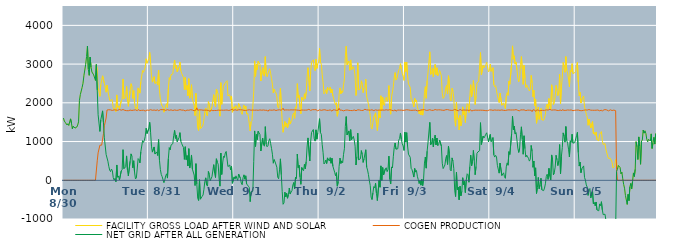
| Category | FACILITY GROSS LOAD AFTER WIND AND SOLAR | COGEN PRODUCTION | NET GRID AFTER ALL GENERATION |
|---|---|---|---|
|  Mon  8/30 | 1606 | 0 | 1606 |
|  Mon  8/30 | 1529 | 0 | 1529 |
|  Mon  8/30 | 1496 | 0 | 1496 |
|  Mon  8/30 | 1489 | 0 | 1489 |
|  Mon  8/30 | 1428 | 0 | 1428 |
|  Mon  8/30 | 1460 | 0 | 1460 |
|  Mon  8/30 | 1415 | 0 | 1415 |
|  Mon  8/30 | 1504 | 0 | 1504 |
|  Mon  8/30 | 1586 | 0 | 1586 |
|  Mon  8/30 | 1477 | 0 | 1477 |
|  Mon  8/30 | 1332 | 0 | 1332 |
|  Mon  8/30 | 1395 | 0 | 1395 |
|  Mon  8/30 | 1419 | 0 | 1419 |
|  Mon  8/30 | 1347 | 0 | 1347 |
|  Mon  8/30 | 1366 | 0 | 1366 |
|  Mon  8/30 | 1374 | 0 | 1374 |
|  Mon  8/30 | 1426 | 0 | 1426 |
|  Mon  8/30 | 1508 | 0 | 1508 |
|  Mon  8/30 | 2064 | 0 | 2064 |
|  Mon  8/30 | 2212 | 0 | 2212 |
|  Mon  8/30 | 2215 | 0 | 2215 |
|  Mon  8/30 | 2397 | 0 | 2397 |
|  Mon  8/30 | 2505 | 0 | 2505 |
|  Mon  8/30 | 2698 | 0 | 2698 |
|  Mon  8/30 | 2696 | 0 | 2696 |
|  Mon  8/30 | 2994 | 0 | 2994 |
|  Mon  8/30 | 3196 | 0 | 3196 |
|  Mon  8/30 | 3467 | 0 | 3467 |
|  Mon  8/30 | 2863 | 0 | 2863 |
|  Mon  8/30 | 2710 | 0 | 2710 |
|  Mon  8/30 | 3181 | 0 | 3181 |
|  Mon  8/30 | 2923 | 0 | 2923 |
|  Mon  8/30 | 2797 | 0 | 2797 |
|  Mon  8/30 | 2781 | 0 | 2781 |
|  Mon  8/30 | 2721 | 0 | 2721 |
|  Mon  8/30 | 2726 | 0 | 2726 |
|  Mon  8/30 | 2579 | 0 | 2579 |
|  Mon  8/30 | 2987 | 0 | 2987 |
|  Mon  8/30 | 2834 | 502 | 2332 |
|  Mon  8/30 | 2400 | 708 | 1692 |
|  Mon  8/30 | 2392 | 714 | 1678 |
|  Mon  8/30 | 2168 | 906 | 1262 |
|  Mon  8/30 | 2476 | 915 | 1561 |
|  Mon  8/30 | 2453 | 907 | 1546 |
|  Mon  8/30 | 2697 | 905 | 1792 |
|  Mon  8/30 | 2689 | 1201 | 1488 |
|  Mon  8/30 | 2502 | 1406 | 1096 |
|  Mon  8/30 | 2523 | 1409 | 1114 |
|  Mon  8/30 | 2274 | 1609 | 665 |
|  Mon  8/30 | 2458 | 1814 | 644 |
|  Mon  8/30 | 2309 | 1817 | 492 |
|  Mon  8/30 | 2182 | 1821 | 361 |
|  Mon  8/30 | 2069 | 1807 | 262 |
|  Mon  8/30 | 2041 | 1817 | 224 |
|  Mon  8/30 | 2091 | 1802 | 289 |
|  Mon  8/30 | 2051 | 1803 | 248 |
|  Mon  8/30 | 1878 | 1808 | 70 |
|  Mon  8/30 | 1826 | 1818 | 8 |
|  Mon  8/30 | 1856 | 1807 | 49 |
|  Mon  8/30 | 1775 | 1814 | -39 |
|  Mon  8/30 | 2204 | 1809 | 395 |
|  Mon  8/30 | 1884 | 1806 | 78 |
|  Mon  8/30 | 1917 | 1807 | 110 |
|  Mon  8/30 | 1835 | 1827 | 8 |
|  Mon  8/30 | 1840 | 1812 | 28 |
|  Mon  8/30 | 2051 | 1810 | 241 |
|  Mon  8/30 | 2090 | 1816 | 274 |
|  Mon  8/30 | 2616 | 1826 | 790 |
|  Mon  8/30 | 2102 | 1803 | 299 |
|  Mon  8/30 | 2108 | 1806 | 302 |
|  Mon  8/30 | 2161 | 1812 | 349 |
|  Mon  8/30 | 2427 | 1798 | 629 |
|  Mon  8/30 | 2080 | 1819 | 261 |
|  Mon  8/30 | 1909 | 1796 | 113 |
|  Mon  8/30 | 1905 | 1806 | 99 |
|  Mon  8/30 | 2303 | 1812 | 491 |
|  Mon  8/30 | 2494 | 1812 | 682 |
|  Mon  8/30 | 2420 | 1803 | 617 |
|  Mon  8/30 | 2114 | 1792 | 322 |
|  Mon  8/30 | 2315 | 1811 | 504 |
|  Mon  8/30 | 2003 | 1806 | 197 |
|  Mon  8/30 | 1853 | 1818 | 35 |
|  Mon  8/30 | 1882 | 1821 | 61 |
|  Mon  8/30 | 1833 | 1797 | 36 |
|  Mon  8/30 | 2384 | 1825 | 559 |
|  Mon  8/30 | 2334 | 1802 | 532 |
|  Mon  8/30 | 2250 | 1801 | 449 |
|  Mon  8/30 | 2544 | 1812 | 732 |
|  Mon  8/30 | 2548 | 1806 | 742 |
|  Mon  8/30 | 2835 | 1812 | 1023 |
|  Mon  8/30 | 2788 | 1809 | 979 |
|  Mon  8/30 | 2854 | 1821 | 1033 |
|  Mon  8/30 | 2923 | 1788 | 1135 |
|  Mon  8/30 | 3137 | 1794 | 1343 |
|  Mon  8/30 | 3021 | 1814 | 1207 |
|  Mon  8/30 | 3036 | 1812 | 1224 |
|  Tue  8/31 | 3146 | 1805 | 1341 |
|  Tue  8/31 | 3303 | 1807 | 1496 |
|  Tue  8/31 | 3059 | 1823 | 1236 |
|  Tue  8/31 | 2695 | 1815 | 880 |
|  Tue  8/31 | 2534 | 1807 | 727 |
|  Tue  8/31 | 2529 | 1787 | 742 |
|  Tue  8/31 | 2674 | 1814 | 860 |
|  Tue  8/31 | 2500 | 1823 | 677 |
|  Tue  8/31 | 2507 | 1804 | 703 |
|  Tue  8/31 | 2540 | 1808 | 732 |
|  Tue  8/31 | 2459 | 1820 | 639 |
|  Tue  8/31 | 2844 | 1793 | 1051 |
|  Tue  8/31 | 2318 | 1802 | 516 |
|  Tue  8/31 | 2100 | 1823 | 277 |
|  Tue  8/31 | 1971 | 1820 | 151 |
|  Tue  8/31 | 1917 | 1823 | 94 |
|  Tue  8/31 | 1890 | 1809 | 81 |
|  Tue  8/31 | 1758 | 1821 | -63 |
|  Tue  8/31 | 1824 | 1810 | 14 |
|  Tue  8/31 | 1921 | 1805 | 116 |
|  Tue  8/31 | 1979 | 1812 | 167 |
|  Tue  8/31 | 1879 | 1823 | 56 |
|  Tue  8/31 | 2377 | 1815 | 562 |
|  Tue  8/31 | 2649 | 1807 | 842 |
|  Tue  8/31 | 2593 | 1807 | 786 |
|  Tue  8/31 | 2725 | 1818 | 907 |
|  Tue  8/31 | 2716 | 1828 | 888 |
|  Tue  8/31 | 2748 | 1802 | 946 |
|  Tue  8/31 | 2969 | 1810 | 1159 |
|  Tue  8/31 | 3103 | 1816 | 1287 |
|  Tue  8/31 | 2889 | 1807 | 1082 |
|  Tue  8/31 | 2968 | 1806 | 1162 |
|  Tue  8/31 | 2800 | 1805 | 995 |
|  Tue  8/31 | 2799 | 1809 | 990 |
|  Tue  8/31 | 2922 | 1818 | 1104 |
|  Tue  8/31 | 3054 | 1824 | 1230 |
|  Tue  8/31 | 2830 | 1822 | 1008 |
|  Tue  8/31 | 2757 | 1811 | 946 |
|  Tue  8/31 | 2763 | 1805 | 958 |
|  Tue  8/31 | 2655 | 1811 | 844 |
|  Tue  8/31 | 2343 | 1803 | 540 |
|  Tue  8/31 | 2657 | 1791 | 866 |
|  Tue  8/31 | 2342 | 1809 | 533 |
|  Tue  8/31 | 2450 | 1812 | 638 |
|  Tue  8/31 | 2184 | 1815 | 369 |
|  Tue  8/31 | 2624 | 1808 | 816 |
|  Tue  8/31 | 2121 | 1805 | 316 |
|  Tue  8/31 | 2281 | 1821 | 460 |
|  Tue  8/31 | 2468 | 1815 | 653 |
|  Tue  8/31 | 2102 | 1814 | 288 |
|  Tue  8/31 | 2079 | 1790 | 289 |
|  Tue  8/31 | 1930 | 1795 | 135 |
|  Tue  8/31 | 1670 | 1805 | -135 |
|  Tue  8/31 | 2244 | 1815 | 429 |
|  Tue  8/31 | 1769 | 1871 | -102 |
|  Tue  8/31 | 1350 | 1809 | -459 |
|  Tue  8/31 | 1285 | 1807 | -522 |
|  Tue  8/31 | 1832 | 1817 | 15 |
|  Tue  8/31 | 1329 | 1818 | -489 |
|  Tue  8/31 | 1334 | 1817 | -483 |
|  Tue  8/31 | 1383 | 1798 | -415 |
|  Tue  8/31 | 1429 | 1809 | -380 |
|  Tue  8/31 | 1574 | 1806 | -232 |
|  Tue  8/31 | 1784 | 1810 | -26 |
|  Tue  8/31 | 1863 | 1800 | 63 |
|  Tue  8/31 | 1691 | 1810 | -119 |
|  Tue  8/31 | 1661 | 1812 | -151 |
|  Tue  8/31 | 2031 | 1804 | 227 |
|  Tue  8/31 | 1959 | 1812 | 147 |
|  Tue  8/31 | 1768 | 1781 | -13 |
|  Tue  8/31 | 1781 | 1816 | -35 |
|  Tue  8/31 | 1896 | 1805 | 91 |
|  Tue  8/31 | 1875 | 1797 | 78 |
|  Tue  8/31 | 2211 | 1808 | 403 |
|  Tue  8/31 | 1988 | 1803 | 185 |
|  Tue  8/31 | 1892 | 1821 | 71 |
|  Tue  8/31 | 2357 | 1802 | 555 |
|  Tue  8/31 | 2284 | 1817 | 467 |
|  Tue  8/31 | 2228 | 1812 | 416 |
|  Tue  8/31 | 1868 | 1812 | 56 |
|  Tue  8/31 | 1655 | 1807 | -152 |
|  Tue  8/31 | 2520 | 1818 | 702 |
|  Tue  8/31 | 1961 | 1811 | 150 |
|  Tue  8/31 | 2254 | 1816 | 438 |
|  Tue  8/31 | 2427 | 1808 | 619 |
|  Tue  8/31 | 2404 | 1814 | 590 |
|  Tue  8/31 | 2516 | 1812 | 704 |
|  Tue  8/31 | 2545 | 1801 | 744 |
|  Tue  8/31 | 2571 | 1814 | 757 |
|  Tue  8/31 | 2179 | 1825 | 354 |
|  Tue  8/31 | 2175 | 1802 | 373 |
|  Tue  8/31 | 2209 | 1815 | 394 |
|  Tue  8/31 | 2083 | 1816 | 267 |
|  Tue  8/31 | 2172 | 1810 | 362 |
|  Tue  8/31 | 1757 | 1836 | -79 |
|  Tue  8/31 | 1742 | 1805 | -63 |
|  Wed  9/1 | 1897 | 1810 | 87 |
|  Wed  9/1 | 1848 | 1820 | 28 |
|  Wed  9/1 | 1928 | 1814 | 114 |
|  Wed  9/1 | 1851 | 1807 | 44 |
|  Wed  9/1 | 1807 | 1810 | -3 |
|  Wed  9/1 | 1981 | 1820 | 161 |
|  Wed  9/1 | 1956 | 1812 | 144 |
|  Wed  9/1 | 1868 | 1821 | 47 |
|  Wed  9/1 | 1748 | 1819 | -71 |
|  Wed  9/1 | 1702 | 1817 | -115 |
|  Wed  9/1 | 1875 | 1810 | 65 |
|  Wed  9/1 | 1945 | 1805 | 140 |
|  Wed  9/1 | 1836 | 1807 | 29 |
|  Wed  9/1 | 1917 | 1802 | 115 |
|  Wed  9/1 | 1709 | 1803 | -94 |
|  Wed  9/1 | 1736 | 1812 | -76 |
|  Wed  9/1 | 1648 | 1802 | -154 |
|  Wed  9/1 | 1635 | 1821 | -186 |
|  Wed  9/1 | 1273 | 1824 | -551 |
|  Wed  9/1 | 1512 | 1809 | -297 |
|  Wed  9/1 | 1538 | 1821 | -283 |
|  Wed  9/1 | 1532 | 1814 | -282 |
|  Wed  9/1 | 2284 | 1794 | 490 |
|  Wed  9/1 | 3083 | 1809 | 1274 |
|  Wed  9/1 | 2682 | 1809 | 873 |
|  Wed  9/1 | 2995 | 1812 | 1183 |
|  Wed  9/1 | 2857 | 1806 | 1051 |
|  Wed  9/1 | 3075 | 1807 | 1268 |
|  Wed  9/1 | 3038 | 1815 | 1223 |
|  Wed  9/1 | 2996 | 1816 | 1180 |
|  Wed  9/1 | 2563 | 1807 | 756 |
|  Wed  9/1 | 2555 | 1809 | 746 |
|  Wed  9/1 | 2911 | 1820 | 1091 |
|  Wed  9/1 | 2736 | 1815 | 921 |
|  Wed  9/1 | 2689 | 1809 | 880 |
|  Wed  9/1 | 3192 | 1807 | 1385 |
|  Wed  9/1 | 2746 | 1814 | 932 |
|  Wed  9/1 | 2673 | 1808 | 865 |
|  Wed  9/1 | 2673 | 1781 | 892 |
|  Wed  9/1 | 2832 | 1815 | 1017 |
|  Wed  9/1 | 2880 | 1807 | 1073 |
|  Wed  9/1 | 2758 | 1811 | 947 |
|  Wed  9/1 | 2627 | 1803 | 824 |
|  Wed  9/1 | 2481 | 1809 | 672 |
|  Wed  9/1 | 2253 | 1812 | 441 |
|  Wed  9/1 | 2353 | 1819 | 534 |
|  Wed  9/1 | 2287 | 1810 | 477 |
|  Wed  9/1 | 2256 | 1801 | 455 |
|  Wed  9/1 | 2153 | 1816 | 337 |
|  Wed  9/1 | 1894 | 1814 | 80 |
|  Wed  9/1 | 1859 | 1820 | 39 |
|  Wed  9/1 | 2088 | 1820 | 268 |
|  Wed  9/1 | 2373 | 1820 | 553 |
|  Wed  9/1 | 1948 | 1806 | 142 |
|  Wed  9/1 | 1518 | 1807 | -289 |
|  Wed  9/1 | 1240 | 1860 | -620 |
|  Wed  9/1 | 1228 | 1811 | -583 |
|  Wed  9/1 | 1514 | 1821 | -307 |
|  Wed  9/1 | 1389 | 1816 | -427 |
|  Wed  9/1 | 1473 | 1810 | -337 |
|  Wed  9/1 | 1352 | 1816 | -464 |
|  Wed  9/1 | 1443 | 1811 | -368 |
|  Wed  9/1 | 1613 | 1813 | -200 |
|  Wed  9/1 | 1452 | 1808 | -356 |
|  Wed  9/1 | 1515 | 1818 | -303 |
|  Wed  9/1 | 1551 | 1817 | -266 |
|  Wed  9/1 | 1695 | 1816 | -121 |
|  Wed  9/1 | 1740 | 1799 | -59 |
|  Wed  9/1 | 1599 | 1818 | -219 |
|  Wed  9/1 | 1896 | 1820 | 76 |
|  Wed  9/1 | 1857 | 1814 | 43 |
|  Wed  9/1 | 2495 | 1818 | 677 |
|  Wed  9/1 | 2136 | 1809 | 327 |
|  Wed  9/1 | 2197 | 1811 | 386 |
|  Wed  9/1 | 1888 | 1802 | 86 |
|  Wed  9/1 | 1718 | 1822 | -104 |
|  Wed  9/1 | 2143 | 1814 | 329 |
|  Wed  9/1 | 2089 | 1816 | 273 |
|  Wed  9/1 | 2058 | 1812 | 246 |
|  Wed  9/1 | 2233 | 1821 | 412 |
|  Wed  9/1 | 2106 | 1811 | 295 |
|  Wed  9/1 | 2282 | 1799 | 483 |
|  Wed  9/1 | 2672 | 1813 | 859 |
|  Wed  9/1 | 2907 | 1813 | 1094 |
|  Wed  9/1 | 2903 | 1833 | 1070 |
|  Wed  9/1 | 2306 | 1808 | 498 |
|  Wed  9/1 | 2796 | 1804 | 992 |
|  Wed  9/1 | 3047 | 1812 | 1235 |
|  Wed  9/1 | 3034 | 1822 | 1212 |
|  Wed  9/1 | 3112 | 1802 | 1310 |
|  Wed  9/1 | 2899 | 1822 | 1077 |
|  Wed  9/1 | 2831 | 1820 | 1011 |
|  Wed  9/1 | 3125 | 1823 | 1302 |
|  Wed  9/1 | 2889 | 1828 | 1061 |
|  Wed  9/1 | 3011 | 1793 | 1218 |
|  Wed  9/1 | 3054 | 1817 | 1237 |
|  Thu  9/2 | 3410 | 1820 | 1590 |
|  Thu  9/2 | 3056 | 1826 | 1230 |
|  Thu  9/2 | 2994 | 1806 | 1188 |
|  Thu  9/2 | 2731 | 1811 | 920 |
|  Thu  9/2 | 2528 | 1817 | 711 |
|  Thu  9/2 | 2234 | 1813 | 421 |
|  Thu  9/2 | 2270 | 1821 | 449 |
|  Thu  9/2 | 2341 | 1818 | 523 |
|  Thu  9/2 | 2237 | 1806 | 431 |
|  Thu  9/2 | 2402 | 1823 | 579 |
|  Thu  9/2 | 2364 | 1805 | 559 |
|  Thu  9/2 | 2321 | 1824 | 497 |
|  Thu  9/2 | 2401 | 1817 | 584 |
|  Thu  9/2 | 2254 | 1815 | 439 |
|  Thu  9/2 | 2354 | 1785 | 569 |
|  Thu  9/2 | 2180 | 1817 | 363 |
|  Thu  9/2 | 2183 | 1813 | 370 |
|  Thu  9/2 | 2022 | 1817 | 205 |
|  Thu  9/2 | 1945 | 1828 | 117 |
|  Thu  9/2 | 2001 | 1804 | 197 |
|  Thu  9/2 | 1654 | 1807 | -153 |
|  Thu  9/2 | 1768 | 1811 | -43 |
|  Thu  9/2 | 2216 | 1859 | 357 |
|  Thu  9/2 | 2385 | 1812 | 573 |
|  Thu  9/2 | 2235 | 1800 | 435 |
|  Thu  9/2 | 2311 | 1810 | 501 |
|  Thu  9/2 | 2265 | 1813 | 452 |
|  Thu  9/2 | 2463 | 1792 | 671 |
|  Thu  9/2 | 2626 | 1801 | 825 |
|  Thu  9/2 | 3200 | 1809 | 1391 |
|  Thu  9/2 | 3461 | 1816 | 1645 |
|  Thu  9/2 | 2984 | 1815 | 1169 |
|  Thu  9/2 | 2983 | 1819 | 1164 |
|  Thu  9/2 | 3080 | 1806 | 1274 |
|  Thu  9/2 | 2840 | 1817 | 1023 |
|  Thu  9/2 | 3108 | 1801 | 1307 |
|  Thu  9/2 | 2856 | 1809 | 1047 |
|  Thu  9/2 | 2857 | 1799 | 1058 |
|  Thu  9/2 | 2936 | 1802 | 1134 |
|  Thu  9/2 | 2855 | 1815 | 1040 |
|  Thu  9/2 | 2690 | 1811 | 879 |
|  Thu  9/2 | 2190 | 1796 | 394 |
|  Thu  9/2 | 2400 | 1788 | 612 |
|  Thu  9/2 | 3035 | 1819 | 1216 |
|  Thu  9/2 | 2335 | 1806 | 529 |
|  Thu  9/2 | 2354 | 1815 | 539 |
|  Thu  9/2 | 2364 | 1808 | 556 |
|  Thu  9/2 | 2569 | 1803 | 766 |
|  Thu  9/2 | 2482 | 1816 | 666 |
|  Thu  9/2 | 2265 | 1804 | 461 |
|  Thu  9/2 | 2369 | 1816 | 553 |
|  Thu  9/2 | 2398 | 1834 | 564 |
|  Thu  9/2 | 2609 | 1821 | 788 |
|  Thu  9/2 | 2159 | 1817 | 342 |
|  Thu  9/2 | 2069 | 1806 | 263 |
|  Thu  9/2 | 1961 | 1814 | 147 |
|  Thu  9/2 | 1807 | 1818 | -11 |
|  Thu  9/2 | 1677 | 1809 | -132 |
|  Thu  9/2 | 1360 | 1796 | -436 |
|  Thu  9/2 | 1323 | 1820 | -497 |
|  Thu  9/2 | 1482 | 1811 | -329 |
|  Thu  9/2 | 1635 | 1799 | -164 |
|  Thu  9/2 | 1616 | 1810 | -194 |
|  Thu  9/2 | 1742 | 1818 | -76 |
|  Thu  9/2 | 1487 | 1827 | -340 |
|  Thu  9/2 | 1284 | 1808 | -524 |
|  Thu  9/2 | 1280 | 1821 | -541 |
|  Thu  9/2 | 1811 | 1813 | -2 |
|  Thu  9/2 | 1609 | 1789 | -180 |
|  Thu  9/2 | 2182 | 1810 | 372 |
|  Thu  9/2 | 1797 | 1799 | -2 |
|  Thu  9/2 | 2143 | 1814 | 329 |
|  Thu  9/2 | 1959 | 1823 | 136 |
|  Thu  9/2 | 1931 | 1810 | 121 |
|  Thu  9/2 | 2110 | 1814 | 296 |
|  Thu  9/2 | 2144 | 1821 | 323 |
|  Thu  9/2 | 2035 | 1813 | 222 |
|  Thu  9/2 | 2093 | 1810 | 283 |
|  Thu  9/2 | 2444 | 1821 | 623 |
|  Thu  9/2 | 1847 | 1823 | 24 |
|  Thu  9/2 | 1706 | 1803 | -97 |
|  Thu  9/2 | 2154 | 1809 | 345 |
|  Thu  9/2 | 2132 | 1815 | 317 |
|  Thu  9/2 | 2415 | 1795 | 620 |
|  Thu  9/2 | 2667 | 1813 | 854 |
|  Thu  9/2 | 2780 | 1817 | 963 |
|  Thu  9/2 | 2587 | 1784 | 803 |
|  Thu  9/2 | 2624 | 1802 | 822 |
|  Thu  9/2 | 2628 | 1814 | 814 |
|  Thu  9/2 | 2840 | 1807 | 1033 |
|  Thu  9/2 | 2887 | 1811 | 1076 |
|  Thu  9/2 | 3009 | 1788 | 1221 |
|  Thu  9/2 | 2866 | 1811 | 1055 |
|  Thu  9/2 | 2751 | 1808 | 943 |
|  Thu  9/2 | 2690 | 1804 | 886 |
|  Thu  9/2 | 2579 | 1809 | 770 |
|  Fri  9/3 | 3053 | 1811 | 1242 |
|  Fri  9/3 | 2806 | 1819 | 987 |
|  Fri  9/3 | 3050 | 1821 | 1229 |
|  Fri  9/3 | 2697 | 1812 | 885 |
|  Fri  9/3 | 2489 | 1815 | 674 |
|  Fri  9/3 | 2506 | 1816 | 690 |
|  Fri  9/3 | 2400 | 1807 | 593 |
|  Fri  9/3 | 2106 | 1797 | 309 |
|  Fri  9/3 | 2079 | 1806 | 273 |
|  Fri  9/3 | 1990 | 1805 | 185 |
|  Fri  9/3 | 1892 | 1809 | 83 |
|  Fri  9/3 | 2112 | 1807 | 305 |
|  Fri  9/3 | 2023 | 1812 | 211 |
|  Fri  9/3 | 2070 | 1817 | 253 |
|  Fri  9/3 | 1897 | 1793 | 104 |
|  Fri  9/3 | 1821 | 1804 | 17 |
|  Fri  9/3 | 1716 | 1799 | -83 |
|  Fri  9/3 | 1792 | 1799 | -7 |
|  Fri  9/3 | 1688 | 1814 | -126 |
|  Fri  9/3 | 1836 | 1809 | 27 |
|  Fri  9/3 | 1682 | 1819 | -137 |
|  Fri  9/3 | 1857 | 1820 | 37 |
|  Fri  9/3 | 2268 | 1824 | 444 |
|  Fri  9/3 | 2418 | 1817 | 601 |
|  Fri  9/3 | 2118 | 1805 | 313 |
|  Fri  9/3 | 2570 | 1818 | 752 |
|  Fri  9/3 | 2788 | 1809 | 979 |
|  Fri  9/3 | 2807 | 1805 | 1002 |
|  Fri  9/3 | 3317 | 1822 | 1495 |
|  Fri  9/3 | 2732 | 1814 | 918 |
|  Fri  9/3 | 2768 | 1806 | 962 |
|  Fri  9/3 | 2903 | 1812 | 1091 |
|  Fri  9/3 | 2666 | 1806 | 860 |
|  Fri  9/3 | 2883 | 1809 | 1074 |
|  Fri  9/3 | 2994 | 1827 | 1167 |
|  Fri  9/3 | 2727 | 1813 | 914 |
|  Fri  9/3 | 2905 | 1814 | 1091 |
|  Fri  9/3 | 2698 | 1803 | 895 |
|  Fri  9/3 | 2741 | 1819 | 922 |
|  Fri  9/3 | 2841 | 1804 | 1037 |
|  Fri  9/3 | 2864 | 1817 | 1047 |
|  Fri  9/3 | 2695 | 1812 | 883 |
|  Fri  9/3 | 2249 | 1809 | 440 |
|  Fri  9/3 | 2114 | 1812 | 302 |
|  Fri  9/3 | 2152 | 1806 | 346 |
|  Fri  9/3 | 2209 | 1813 | 396 |
|  Fri  9/3 | 2392 | 1822 | 570 |
|  Fri  9/3 | 2448 | 1808 | 640 |
|  Fri  9/3 | 2235 | 1825 | 410 |
|  Fri  9/3 | 2699 | 1821 | 878 |
|  Fri  9/3 | 2497 | 1812 | 685 |
|  Fri  9/3 | 2079 | 1811 | 268 |
|  Fri  9/3 | 2048 | 1806 | 242 |
|  Fri  9/3 | 2377 | 1799 | 578 |
|  Fri  9/3 | 2301 | 1806 | 495 |
|  Fri  9/3 | 2120 | 1823 | 297 |
|  Fri  9/3 | 1573 | 1829 | -256 |
|  Fri  9/3 | 1395 | 1816 | -421 |
|  Fri  9/3 | 2018 | 1812 | 206 |
|  Fri  9/3 | 1576 | 1818 | -242 |
|  Fri  9/3 | 1612 | 1793 | -181 |
|  Fri  9/3 | 1299 | 1803 | -504 |
|  Fri  9/3 | 1674 | 1828 | -154 |
|  Fri  9/3 | 1407 | 1808 | -401 |
|  Fri  9/3 | 1519 | 1805 | -286 |
|  Fri  9/3 | 1896 | 1830 | 66 |
|  Fri  9/3 | 1692 | 1814 | -122 |
|  Fri  9/3 | 1789 | 1818 | -29 |
|  Fri  9/3 | 1493 | 1811 | -318 |
|  Fri  9/3 | 1820 | 1814 | 6 |
|  Fri  9/3 | 1979 | 1811 | 168 |
|  Fri  9/3 | 1953 | 1811 | 142 |
|  Fri  9/3 | 1753 | 1804 | -51 |
|  Fri  9/3 | 2155 | 1802 | 353 |
|  Fri  9/3 | 2467 | 1820 | 647 |
|  Fri  9/3 | 2160 | 1788 | 372 |
|  Fri  9/3 | 2297 | 1807 | 490 |
|  Fri  9/3 | 2575 | 1804 | 771 |
|  Fri  9/3 | 2316 | 1811 | 505 |
|  Fri  9/3 | 1955 | 1811 | 144 |
|  Fri  9/3 | 2171 | 1814 | 357 |
|  Fri  9/3 | 2504 | 1809 | 695 |
|  Fri  9/3 | 2527 | 1798 | 729 |
|  Fri  9/3 | 2562 | 1809 | 753 |
|  Fri  9/3 | 2574 | 1809 | 765 |
|  Fri  9/3 | 3297 | 1810 | 1487 |
|  Fri  9/3 | 2727 | 1803 | 924 |
|  Fri  9/3 | 2730 | 1808 | 922 |
|  Fri  9/3 | 2965 | 1822 | 1143 |
|  Fri  9/3 | 2899 | 1805 | 1094 |
|  Fri  9/3 | 2949 | 1811 | 1138 |
|  Fri  9/3 | 2987 | 1798 | 1189 |
|  Fri  9/3 | 3047 | 1821 | 1226 |
|  Fri  9/3 | 3048 | 1797 | 1251 |
|  Fri  9/3 | 2799 | 1806 | 993 |
|  Fri  9/3 | 2828 | 1816 | 1012 |
|  Sat  9/4 | 3001 | 1819 | 1182 |
|  Sat  9/4 | 2812 | 1816 | 996 |
|  Sat  9/4 | 2854 | 1812 | 1042 |
|  Sat  9/4 | 2908 | 1805 | 1103 |
|  Sat  9/4 | 2467 | 1810 | 657 |
|  Sat  9/4 | 2415 | 1816 | 599 |
|  Sat  9/4 | 2442 | 1799 | 643 |
|  Sat  9/4 | 2419 | 1809 | 610 |
|  Sat  9/4 | 2190 | 1804 | 386 |
|  Sat  9/4 | 2212 | 1812 | 400 |
|  Sat  9/4 | 2007 | 1823 | 184 |
|  Sat  9/4 | 2251 | 1807 | 444 |
|  Sat  9/4 | 2271 | 1817 | 454 |
|  Sat  9/4 | 1938 | 1816 | 122 |
|  Sat  9/4 | 1957 | 1812 | 145 |
|  Sat  9/4 | 1999 | 1806 | 193 |
|  Sat  9/4 | 1908 | 1817 | 91 |
|  Sat  9/4 | 1852 | 1802 | 50 |
|  Sat  9/4 | 2158 | 1811 | 347 |
|  Sat  9/4 | 2262 | 1813 | 449 |
|  Sat  9/4 | 2192 | 1804 | 388 |
|  Sat  9/4 | 2557 | 1818 | 739 |
|  Sat  9/4 | 2481 | 1813 | 668 |
|  Sat  9/4 | 2497 | 1814 | 683 |
|  Sat  9/4 | 3012 | 1816 | 1196 |
|  Sat  9/4 | 3470 | 1815 | 1655 |
|  Sat  9/4 | 3125 | 1821 | 1304 |
|  Sat  9/4 | 3214 | 1815 | 1399 |
|  Sat  9/4 | 3001 | 1807 | 1194 |
|  Sat  9/4 | 3054 | 1824 | 1230 |
|  Sat  9/4 | 2854 | 1812 | 1042 |
|  Sat  9/4 | 2637 | 1806 | 831 |
|  Sat  9/4 | 2542 | 1823 | 719 |
|  Sat  9/4 | 2619 | 1790 | 829 |
|  Sat  9/4 | 2993 | 1818 | 1175 |
|  Sat  9/4 | 3194 | 1814 | 1380 |
|  Sat  9/4 | 2869 | 1816 | 1053 |
|  Sat  9/4 | 2477 | 1805 | 672 |
|  Sat  9/4 | 2967 | 1818 | 1149 |
|  Sat  9/4 | 2630 | 1815 | 815 |
|  Sat  9/4 | 2399 | 1799 | 600 |
|  Sat  9/4 | 2462 | 1815 | 647 |
|  Sat  9/4 | 2417 | 1811 | 606 |
|  Sat  9/4 | 2358 | 1792 | 566 |
|  Sat  9/4 | 2305 | 1810 | 495 |
|  Sat  9/4 | 2356 | 1814 | 542 |
|  Sat  9/4 | 2707 | 1808 | 899 |
|  Sat  9/4 | 2519 | 1772 | 747 |
|  Sat  9/4 | 2156 | 1821 | 335 |
|  Sat  9/4 | 2322 | 1824 | 498 |
|  Sat  9/4 | 1926 | 1811 | 115 |
|  Sat  9/4 | 2099 | 1778 | 321 |
|  Sat  9/4 | 1472 | 1812 | -340 |
|  Sat  9/4 | 1625 | 1813 | -188 |
|  Sat  9/4 | 1890 | 1817 | 73 |
|  Sat  9/4 | 1573 | 1791 | -218 |
|  Sat  9/4 | 1672 | 1795 | -123 |
|  Sat  9/4 | 1855 | 1802 | 53 |
|  Sat  9/4 | 1560 | 1807 | -247 |
|  Sat  9/4 | 1538 | 1806 | -268 |
|  Sat  9/4 | 1550 | 1818 | -268 |
|  Sat  9/4 | 1604 | 1805 | -201 |
|  Sat  9/4 | 1702 | 1794 | -92 |
|  Sat  9/4 | 1915 | 1817 | 98 |
|  Sat  9/4 | 1968 | 1812 | 156 |
|  Sat  9/4 | 1835 | 1812 | 23 |
|  Sat  9/4 | 2111 | 1804 | 307 |
|  Sat  9/4 | 1929 | 1831 | 98 |
|  Sat  9/4 | 1822 | 1812 | 10 |
|  Sat  9/4 | 2465 | 1811 | 654 |
|  Sat  9/4 | 2335 | 1805 | 530 |
|  Sat  9/4 | 1956 | 1816 | 140 |
|  Sat  9/4 | 2011 | 1813 | 198 |
|  Sat  9/4 | 2157 | 1817 | 340 |
|  Sat  9/4 | 2449 | 1804 | 645 |
|  Sat  9/4 | 2334 | 1805 | 529 |
|  Sat  9/4 | 2186 | 1807 | 379 |
|  Sat  9/4 | 2297 | 1801 | 496 |
|  Sat  9/4 | 2735 | 1813 | 922 |
|  Sat  9/4 | 1981 | 1817 | 164 |
|  Sat  9/4 | 2409 | 1789 | 620 |
|  Sat  9/4 | 2665 | 1822 | 843 |
|  Sat  9/4 | 3040 | 1816 | 1224 |
|  Sat  9/4 | 2940 | 1805 | 1135 |
|  Sat  9/4 | 2787 | 1803 | 984 |
|  Sat  9/4 | 3193 | 1806 | 1387 |
|  Sat  9/4 | 2839 | 1814 | 1025 |
|  Sat  9/4 | 2772 | 1815 | 957 |
|  Sat  9/4 | 2613 | 1810 | 803 |
|  Sat  9/4 | 2412 | 1811 | 601 |
|  Sat  9/4 | 2837 | 1817 | 1020 |
|  Sat  9/4 | 2796 | 1815 | 981 |
|  Sat  9/4 | 3012 | 1823 | 1189 |
|  Sat  9/4 | 2756 | 1796 | 960 |
|  Sat  9/4 | 2754 | 1799 | 955 |
|  Sat  9/4 | 2778 | 1807 | 971 |
|  Sun  9/5 | 2808 | 1816 | 992 |
|  Sun  9/5 | 2963 | 1812 | 1151 |
|  Sun  9/5 | 3043 | 1805 | 1238 |
|  Sun  9/5 | 2526 | 1813 | 713 |
|  Sun  9/5 | 2179 | 1812 | 367 |
|  Sun  9/5 | 2268 | 1800 | 468 |
|  Sun  9/5 | 1994 | 1798 | 196 |
|  Sun  9/5 | 2094 | 1796 | 298 |
|  Sun  9/5 | 2092 | 1802 | 290 |
|  Sun  9/5 | 2178 | 1807 | 371 |
|  Sun  9/5 | 1886 | 1811 | 75 |
|  Sun  9/5 | 1818 | 1816 | 2 |
|  Sun  9/5 | 1700 | 1820 | -120 |
|  Sun  9/5 | 1636 | 1812 | -176 |
|  Sun  9/5 | 1420 | 1810 | -390 |
|  Sun  9/5 | 1582 | 1826 | -244 |
|  Sun  9/5 | 1599 | 1813 | -214 |
|  Sun  9/5 | 1354 | 1810 | -456 |
|  Sun  9/5 | 1346 | 1795 | -449 |
|  Sun  9/5 | 1515 | 1808 | -293 |
|  Sun  9/5 | 1200 | 1811 | -611 |
|  Sun  9/5 | 1235 | 1807 | -572 |
|  Sun  9/5 | 1157 | 1816 | -659 |
|  Sun  9/5 | 1248 | 1809 | -561 |
|  Sun  9/5 | 1051 | 1816 | -765 |
|  Sun  9/5 | 1045 | 1814 | -769 |
|  Sun  9/5 | 1019 | 1807 | -788 |
|  Sun  9/5 | 1184 | 1794 | -610 |
|  Sun  9/5 | 1160 | 1816 | -656 |
|  Sun  9/5 | 1258 | 1811 | -553 |
|  Sun  9/5 | 1018 | 1783 | -765 |
|  Sun  9/5 | 922 | 1810 | -888 |
|  Sun  9/5 | 936 | 1799 | -863 |
|  Sun  9/5 | 949 | 1825 | -876 |
|  Sun  9/5 | 801 | 1820 | -1019 |
|  Sun  9/5 | 784 | 1816 | -1032 |
|  Sun  9/5 | 625 | 1816 | -1191 |
|  Sun  9/5 | 564 | 1792 | -1228 |
|  Sun  9/5 | 586 | 1811 | -1225 |
|  Sun  9/5 | 568 | 1819 | -1251 |
|  Sun  9/5 | 573 | 1820 | -1247 |
|  Sun  9/5 | 465 | 1801 | -1336 |
|  Sun  9/5 | 316 | 1814 | -1498 |
|  Sun  9/5 | 335 | 1812 | -1477 |
|  Sun  9/5 | 374 | 1820 | -1446 |
|  Sun  9/5 | 536 | 1797 | -1261 |
|  Sun  9/5 | 502 | 272 | 230 |
|  Sun  9/5 | 281 | 0 | 281 |
|  Sun  9/5 | 382 | 0 | 382 |
|  Sun  9/5 | 375 | 0 | 375 |
|  Sun  9/5 | 329 | 0 | 329 |
|  Sun  9/5 | 162 | 0 | 162 |
|  Sun  9/5 | 212 | 0 | 212 |
|  Sun  9/5 | 37 | 0 | 37 |
|  Sun  9/5 | -106 | 0 | -106 |
|  Sun  9/5 | -204 | 0 | -204 |
|  Sun  9/5 | -391 | 0 | -391 |
|  Sun  9/5 | -415 | 0 | -415 |
|  Sun  9/5 | -622 | 0 | -622 |
|  Sun  9/5 | -364 | 0 | -364 |
|  Sun  9/5 | -525 | 0 | -525 |
|  Sun  9/5 | -171 | 0 | -171 |
|  Sun  9/5 | -82 | 0 | -82 |
|  Sun  9/5 | -221 | 0 | -221 |
|  Sun  9/5 | -34 | 0 | -34 |
|  Sun  9/5 | 190 | 0 | 190 |
|  Sun  9/5 | 97 | 0 | 97 |
|  Sun  9/5 | 284 | 0 | 284 |
|  Sun  9/5 | 995 | 0 | 995 |
|  Sun  9/5 | 865 | 0 | 865 |
|  Sun  9/5 | 536 | 0 | 536 |
|  Sun  9/5 | 1119 | 0 | 1119 |
|  Sun  9/5 | 877 | 0 | 877 |
|  Sun  9/5 | 413 | 0 | 413 |
|  Sun  9/5 | 1012 | 0 | 1012 |
|  Sun  9/5 | 1038 | 0 | 1038 |
|  Sun  9/5 | 1296 | 0 | 1296 |
|  Sun  9/5 | 1217 | 0 | 1217 |
|  Sun  9/5 | 1278 | 0 | 1278 |
|  Sun  9/5 | 1208 | 0 | 1208 |
|  Sun  9/5 | 1060 | 0 | 1060 |
|  Sun  9/5 | 995 | 0 | 995 |
|  Sun  9/5 | 1060 | 0 | 1060 |
|  Sun  9/5 | 1062 | 0 | 1062 |
|  Sun  9/5 | 1014 | 0 | 1014 |
|  Sun  9/5 | 1198 | 0 | 1198 |
|  Sun  9/5 | 822 | 0 | 822 |
|  Sun  9/5 | 966 | 0 | 966 |
|  Sun  9/5 | 1108 | 0 | 1108 |
|  Sun  9/5 | 935 | 0 | 935 |
|  Sun  9/5 | 1192 | 0 | 1192 |
|  Sun  9/5 | 1236 | 0 | 1236 |